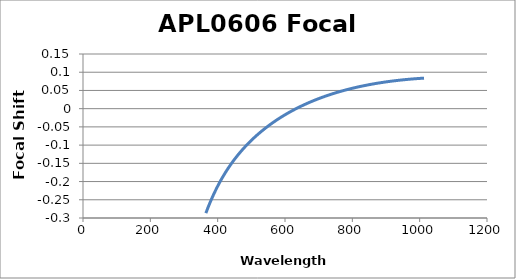
| Category | Focal Shift (mm) |
|---|---|
| 365.0 | -0.287 |
| 366.0 | -0.284 |
| 367.0 | -0.282 |
| 368.0 | -0.279 |
| 369.0 | -0.277 |
| 370.0 | -0.275 |
| 371.0 | -0.272 |
| 372.0 | -0.27 |
| 373.0 | -0.268 |
| 374.0 | -0.265 |
| 375.0 | -0.263 |
| 376.0 | -0.261 |
| 377.0 | -0.258 |
| 378.0 | -0.256 |
| 379.0 | -0.254 |
| 380.0 | -0.252 |
| 381.0 | -0.25 |
| 382.0 | -0.248 |
| 383.0 | -0.246 |
| 384.0 | -0.243 |
| 385.0 | -0.241 |
| 386.0 | -0.239 |
| 387.0 | -0.237 |
| 388.0 | -0.235 |
| 389.0 | -0.233 |
| 390.0 | -0.231 |
| 391.0 | -0.229 |
| 392.0 | -0.228 |
| 393.0 | -0.226 |
| 394.0 | -0.224 |
| 395.0 | -0.222 |
| 396.0 | -0.22 |
| 397.0 | -0.218 |
| 398.0 | -0.216 |
| 399.0 | -0.214 |
| 400.0 | -0.213 |
| 401.0 | -0.211 |
| 402.0 | -0.209 |
| 403.0 | -0.207 |
| 404.0 | -0.206 |
| 405.0 | -0.204 |
| 406.0 | -0.202 |
| 407.0 | -0.201 |
| 408.0 | -0.199 |
| 409.0 | -0.197 |
| 410.0 | -0.196 |
| 411.0 | -0.194 |
| 412.0 | -0.192 |
| 413.0 | -0.191 |
| 414.0 | -0.189 |
| 415.0 | -0.188 |
| 416.0 | -0.186 |
| 417.0 | -0.184 |
| 418.0 | -0.183 |
| 419.0 | -0.181 |
| 420.0 | -0.18 |
| 421.0 | -0.178 |
| 422.0 | -0.177 |
| 423.0 | -0.175 |
| 424.0 | -0.174 |
| 425.0 | -0.172 |
| 426.0 | -0.171 |
| 427.0 | -0.169 |
| 428.0 | -0.168 |
| 429.0 | -0.167 |
| 430.0 | -0.165 |
| 431.0 | -0.164 |
| 432.0 | -0.162 |
| 433.0 | -0.161 |
| 434.0 | -0.16 |
| 435.0 | -0.158 |
| 436.0 | -0.157 |
| 437.0 | -0.156 |
| 438.0 | -0.154 |
| 439.0 | -0.153 |
| 440.0 | -0.152 |
| 441.0 | -0.15 |
| 442.0 | -0.149 |
| 443.0 | -0.148 |
| 444.0 | -0.147 |
| 445.0 | -0.145 |
| 446.0 | -0.144 |
| 447.0 | -0.143 |
| 448.0 | -0.142 |
| 449.0 | -0.14 |
| 450.0 | -0.139 |
| 451.0 | -0.138 |
| 452.0 | -0.137 |
| 453.0 | -0.135 |
| 454.0 | -0.134 |
| 455.0 | -0.133 |
| 456.0 | -0.132 |
| 457.0 | -0.131 |
| 458.0 | -0.13 |
| 459.0 | -0.128 |
| 460.0 | -0.127 |
| 461.0 | -0.126 |
| 462.0 | -0.125 |
| 463.0 | -0.124 |
| 464.0 | -0.123 |
| 465.0 | -0.122 |
| 466.0 | -0.121 |
| 467.0 | -0.12 |
| 468.0 | -0.118 |
| 469.0 | -0.117 |
| 470.0 | -0.116 |
| 471.0 | -0.115 |
| 472.0 | -0.114 |
| 473.0 | -0.113 |
| 474.0 | -0.112 |
| 475.0 | -0.111 |
| 476.0 | -0.11 |
| 477.0 | -0.109 |
| 478.0 | -0.108 |
| 479.0 | -0.107 |
| 480.0 | -0.106 |
| 481.0 | -0.105 |
| 482.0 | -0.104 |
| 483.0 | -0.103 |
| 484.0 | -0.102 |
| 485.0 | -0.101 |
| 486.0 | -0.1 |
| 487.0 | -0.099 |
| 488.0 | -0.098 |
| 489.0 | -0.097 |
| 490.0 | -0.096 |
| 491.0 | -0.095 |
| 492.0 | -0.094 |
| 493.0 | -0.093 |
| 494.0 | -0.092 |
| 495.0 | -0.092 |
| 496.0 | -0.091 |
| 497.0 | -0.09 |
| 498.0 | -0.089 |
| 499.0 | -0.088 |
| 500.0 | -0.087 |
| 501.0 | -0.086 |
| 502.0 | -0.085 |
| 503.0 | -0.084 |
| 504.0 | -0.083 |
| 505.0 | -0.083 |
| 506.0 | -0.082 |
| 507.0 | -0.081 |
| 508.0 | -0.08 |
| 509.0 | -0.079 |
| 510.0 | -0.078 |
| 511.0 | -0.077 |
| 512.0 | -0.077 |
| 513.0 | -0.076 |
| 514.0 | -0.075 |
| 515.0 | -0.074 |
| 516.0 | -0.073 |
| 517.0 | -0.072 |
| 518.0 | -0.072 |
| 519.0 | -0.071 |
| 520.0 | -0.07 |
| 521.0 | -0.069 |
| 522.0 | -0.068 |
| 523.0 | -0.068 |
| 524.0 | -0.067 |
| 525.0 | -0.066 |
| 526.0 | -0.065 |
| 527.0 | -0.065 |
| 528.0 | -0.064 |
| 529.0 | -0.063 |
| 530.0 | -0.062 |
| 531.0 | -0.061 |
| 532.0 | -0.061 |
| 533.0 | -0.06 |
| 534.0 | -0.059 |
| 535.0 | -0.058 |
| 536.0 | -0.058 |
| 537.0 | -0.057 |
| 538.0 | -0.056 |
| 539.0 | -0.055 |
| 540.0 | -0.055 |
| 541.0 | -0.054 |
| 542.0 | -0.053 |
| 543.0 | -0.053 |
| 544.0 | -0.052 |
| 545.0 | -0.051 |
| 546.0 | -0.05 |
| 547.0 | -0.05 |
| 548.0 | -0.049 |
| 549.0 | -0.048 |
| 550.0 | -0.048 |
| 551.0 | -0.047 |
| 552.0 | -0.046 |
| 553.0 | -0.046 |
| 554.0 | -0.045 |
| 555.0 | -0.044 |
| 556.0 | -0.044 |
| 557.0 | -0.043 |
| 558.0 | -0.042 |
| 559.0 | -0.042 |
| 560.0 | -0.041 |
| 561.0 | -0.04 |
| 562.0 | -0.04 |
| 563.0 | -0.039 |
| 564.0 | -0.038 |
| 565.0 | -0.038 |
| 566.0 | -0.037 |
| 567.0 | -0.036 |
| 568.0 | -0.036 |
| 569.0 | -0.035 |
| 570.0 | -0.034 |
| 571.0 | -0.034 |
| 572.0 | -0.033 |
| 573.0 | -0.033 |
| 574.0 | -0.032 |
| 575.0 | -0.031 |
| 576.0 | -0.031 |
| 577.0 | -0.03 |
| 578.0 | -0.03 |
| 579.0 | -0.029 |
| 580.0 | -0.028 |
| 581.0 | -0.028 |
| 582.0 | -0.027 |
| 583.0 | -0.027 |
| 584.0 | -0.026 |
| 585.0 | -0.025 |
| 586.0 | -0.025 |
| 587.0 | -0.024 |
| 588.0 | -0.024 |
| 589.0 | -0.023 |
| 590.0 | -0.022 |
| 591.0 | -0.022 |
| 592.0 | -0.021 |
| 593.0 | -0.021 |
| 594.0 | -0.02 |
| 595.0 | -0.02 |
| 596.0 | -0.019 |
| 597.0 | -0.018 |
| 598.0 | -0.018 |
| 599.0 | -0.017 |
| 600.0 | -0.017 |
| 601.0 | -0.016 |
| 602.0 | -0.016 |
| 603.0 | -0.015 |
| 604.0 | -0.015 |
| 605.0 | -0.014 |
| 606.0 | -0.014 |
| 607.0 | -0.013 |
| 608.0 | -0.013 |
| 609.0 | -0.012 |
| 610.0 | -0.011 |
| 611.0 | -0.011 |
| 612.0 | -0.01 |
| 613.0 | -0.01 |
| 614.0 | -0.009 |
| 615.0 | -0.009 |
| 616.0 | -0.008 |
| 617.0 | -0.008 |
| 618.0 | -0.007 |
| 619.0 | -0.007 |
| 620.0 | -0.006 |
| 621.0 | -0.006 |
| 622.0 | -0.005 |
| 623.0 | -0.005 |
| 624.0 | -0.004 |
| 625.0 | -0.004 |
| 626.0 | -0.003 |
| 627.0 | -0.003 |
| 628.0 | -0.002 |
| 629.0 | -0.002 |
| 630.0 | -0.001 |
| 631.0 | -0.001 |
| 632.0 | 0 |
| 633.0 | 0 |
| 634.0 | 0 |
| 635.0 | 0.001 |
| 636.0 | 0.001 |
| 637.0 | 0.002 |
| 638.0 | 0.002 |
| 639.0 | 0.003 |
| 640.0 | 0.003 |
| 641.0 | 0.004 |
| 642.0 | 0.004 |
| 643.0 | 0.005 |
| 644.0 | 0.005 |
| 645.0 | 0.006 |
| 646.0 | 0.006 |
| 647.0 | 0.006 |
| 648.0 | 0.007 |
| 649.0 | 0.007 |
| 650.0 | 0.008 |
| 651.0 | 0.008 |
| 652.0 | 0.009 |
| 653.0 | 0.009 |
| 654.0 | 0.01 |
| 655.0 | 0.01 |
| 656.0 | 0.01 |
| 657.0 | 0.011 |
| 658.0 | 0.011 |
| 659.0 | 0.012 |
| 660.0 | 0.012 |
| 661.0 | 0.012 |
| 662.0 | 0.013 |
| 663.0 | 0.013 |
| 664.0 | 0.014 |
| 665.0 | 0.014 |
| 666.0 | 0.015 |
| 667.0 | 0.015 |
| 668.0 | 0.015 |
| 669.0 | 0.016 |
| 670.0 | 0.016 |
| 671.0 | 0.017 |
| 672.0 | 0.017 |
| 673.0 | 0.017 |
| 674.0 | 0.018 |
| 675.0 | 0.018 |
| 676.0 | 0.019 |
| 677.0 | 0.019 |
| 678.0 | 0.019 |
| 679.0 | 0.02 |
| 680.0 | 0.02 |
| 681.0 | 0.021 |
| 682.0 | 0.021 |
| 683.0 | 0.021 |
| 684.0 | 0.022 |
| 685.0 | 0.022 |
| 686.0 | 0.022 |
| 687.0 | 0.023 |
| 688.0 | 0.023 |
| 689.0 | 0.024 |
| 690.0 | 0.024 |
| 691.0 | 0.024 |
| 692.0 | 0.025 |
| 693.0 | 0.025 |
| 694.0 | 0.025 |
| 695.0 | 0.026 |
| 696.0 | 0.026 |
| 697.0 | 0.026 |
| 698.0 | 0.027 |
| 699.0 | 0.027 |
| 700.0 | 0.028 |
| 701.0 | 0.028 |
| 702.0 | 0.028 |
| 703.0 | 0.029 |
| 704.0 | 0.029 |
| 705.0 | 0.029 |
| 706.0 | 0.03 |
| 707.0 | 0.03 |
| 708.0 | 0.03 |
| 709.0 | 0.031 |
| 710.0 | 0.031 |
| 711.0 | 0.031 |
| 712.0 | 0.032 |
| 713.0 | 0.032 |
| 714.0 | 0.032 |
| 715.0 | 0.033 |
| 716.0 | 0.033 |
| 717.0 | 0.033 |
| 718.0 | 0.034 |
| 719.0 | 0.034 |
| 720.0 | 0.034 |
| 721.0 | 0.035 |
| 722.0 | 0.035 |
| 723.0 | 0.035 |
| 724.0 | 0.036 |
| 725.0 | 0.036 |
| 726.0 | 0.036 |
| 727.0 | 0.036 |
| 728.0 | 0.037 |
| 729.0 | 0.037 |
| 730.0 | 0.037 |
| 731.0 | 0.038 |
| 732.0 | 0.038 |
| 733.0 | 0.038 |
| 734.0 | 0.039 |
| 735.0 | 0.039 |
| 736.0 | 0.039 |
| 737.0 | 0.04 |
| 738.0 | 0.04 |
| 739.0 | 0.04 |
| 740.0 | 0.04 |
| 741.0 | 0.041 |
| 742.0 | 0.041 |
| 743.0 | 0.041 |
| 744.0 | 0.042 |
| 745.0 | 0.042 |
| 746.0 | 0.042 |
| 747.0 | 0.042 |
| 748.0 | 0.043 |
| 749.0 | 0.043 |
| 750.0 | 0.043 |
| 751.0 | 0.044 |
| 752.0 | 0.044 |
| 753.0 | 0.044 |
| 754.0 | 0.044 |
| 755.0 | 0.045 |
| 756.0 | 0.045 |
| 757.0 | 0.045 |
| 758.0 | 0.046 |
| 759.0 | 0.046 |
| 760.0 | 0.046 |
| 761.0 | 0.046 |
| 762.0 | 0.047 |
| 763.0 | 0.047 |
| 764.0 | 0.047 |
| 765.0 | 0.047 |
| 766.0 | 0.048 |
| 767.0 | 0.048 |
| 768.0 | 0.048 |
| 769.0 | 0.048 |
| 770.0 | 0.049 |
| 771.0 | 0.049 |
| 772.0 | 0.049 |
| 773.0 | 0.05 |
| 774.0 | 0.05 |
| 775.0 | 0.05 |
| 776.0 | 0.05 |
| 777.0 | 0.051 |
| 778.0 | 0.051 |
| 779.0 | 0.051 |
| 780.0 | 0.051 |
| 781.0 | 0.051 |
| 782.0 | 0.052 |
| 783.0 | 0.052 |
| 784.0 | 0.052 |
| 785.0 | 0.052 |
| 786.0 | 0.053 |
| 787.0 | 0.053 |
| 788.0 | 0.053 |
| 789.0 | 0.053 |
| 790.0 | 0.054 |
| 791.0 | 0.054 |
| 792.0 | 0.054 |
| 793.0 | 0.054 |
| 794.0 | 0.055 |
| 795.0 | 0.055 |
| 796.0 | 0.055 |
| 797.0 | 0.055 |
| 798.0 | 0.055 |
| 799.0 | 0.056 |
| 800.0 | 0.056 |
| 801.0 | 0.056 |
| 802.0 | 0.056 |
| 803.0 | 0.057 |
| 804.0 | 0.057 |
| 805.0 | 0.057 |
| 806.0 | 0.057 |
| 807.0 | 0.057 |
| 808.0 | 0.058 |
| 809.0 | 0.058 |
| 810.0 | 0.058 |
| 811.0 | 0.058 |
| 812.0 | 0.059 |
| 813.0 | 0.059 |
| 814.0 | 0.059 |
| 815.0 | 0.059 |
| 816.0 | 0.059 |
| 817.0 | 0.06 |
| 818.0 | 0.06 |
| 819.0 | 0.06 |
| 820.0 | 0.06 |
| 821.0 | 0.06 |
| 822.0 | 0.061 |
| 823.0 | 0.061 |
| 824.0 | 0.061 |
| 825.0 | 0.061 |
| 826.0 | 0.061 |
| 827.0 | 0.062 |
| 828.0 | 0.062 |
| 829.0 | 0.062 |
| 830.0 | 0.062 |
| 831.0 | 0.062 |
| 832.0 | 0.063 |
| 833.0 | 0.063 |
| 834.0 | 0.063 |
| 835.0 | 0.063 |
| 836.0 | 0.063 |
| 837.0 | 0.063 |
| 838.0 | 0.064 |
| 839.0 | 0.064 |
| 840.0 | 0.064 |
| 841.0 | 0.064 |
| 842.0 | 0.064 |
| 843.0 | 0.065 |
| 844.0 | 0.065 |
| 845.0 | 0.065 |
| 846.0 | 0.065 |
| 847.0 | 0.065 |
| 848.0 | 0.065 |
| 849.0 | 0.066 |
| 850.0 | 0.066 |
| 851.0 | 0.066 |
| 852.0 | 0.066 |
| 853.0 | 0.066 |
| 854.0 | 0.067 |
| 855.0 | 0.067 |
| 856.0 | 0.067 |
| 857.0 | 0.067 |
| 858.0 | 0.067 |
| 859.0 | 0.067 |
| 860.0 | 0.068 |
| 861.0 | 0.068 |
| 862.0 | 0.068 |
| 863.0 | 0.068 |
| 864.0 | 0.068 |
| 865.0 | 0.068 |
| 866.0 | 0.069 |
| 867.0 | 0.069 |
| 868.0 | 0.069 |
| 869.0 | 0.069 |
| 870.0 | 0.069 |
| 871.0 | 0.069 |
| 872.0 | 0.069 |
| 873.0 | 0.07 |
| 874.0 | 0.07 |
| 875.0 | 0.07 |
| 876.0 | 0.07 |
| 877.0 | 0.07 |
| 878.0 | 0.07 |
| 879.0 | 0.07 |
| 880.0 | 0.071 |
| 881.0 | 0.071 |
| 882.0 | 0.071 |
| 883.0 | 0.071 |
| 884.0 | 0.071 |
| 885.0 | 0.071 |
| 886.0 | 0.072 |
| 887.0 | 0.072 |
| 888.0 | 0.072 |
| 889.0 | 0.072 |
| 890.0 | 0.072 |
| 891.0 | 0.072 |
| 892.0 | 0.072 |
| 893.0 | 0.072 |
| 894.0 | 0.073 |
| 895.0 | 0.073 |
| 896.0 | 0.073 |
| 897.0 | 0.073 |
| 898.0 | 0.073 |
| 899.0 | 0.073 |
| 900.0 | 0.073 |
| 901.0 | 0.074 |
| 902.0 | 0.074 |
| 903.0 | 0.074 |
| 904.0 | 0.074 |
| 905.0 | 0.074 |
| 906.0 | 0.074 |
| 907.0 | 0.074 |
| 908.0 | 0.074 |
| 909.0 | 0.075 |
| 910.0 | 0.075 |
| 911.0 | 0.075 |
| 912.0 | 0.075 |
| 913.0 | 0.075 |
| 914.0 | 0.075 |
| 915.0 | 0.075 |
| 916.0 | 0.075 |
| 917.0 | 0.076 |
| 918.0 | 0.076 |
| 919.0 | 0.076 |
| 920.0 | 0.076 |
| 921.0 | 0.076 |
| 922.0 | 0.076 |
| 923.0 | 0.076 |
| 924.0 | 0.076 |
| 925.0 | 0.076 |
| 926.0 | 0.077 |
| 927.0 | 0.077 |
| 928.0 | 0.077 |
| 929.0 | 0.077 |
| 930.0 | 0.077 |
| 931.0 | 0.077 |
| 932.0 | 0.077 |
| 933.0 | 0.077 |
| 934.0 | 0.077 |
| 935.0 | 0.078 |
| 936.0 | 0.078 |
| 937.0 | 0.078 |
| 938.0 | 0.078 |
| 939.0 | 0.078 |
| 940.0 | 0.078 |
| 941.0 | 0.078 |
| 942.0 | 0.078 |
| 943.0 | 0.078 |
| 944.0 | 0.078 |
| 945.0 | 0.079 |
| 946.0 | 0.079 |
| 947.0 | 0.079 |
| 948.0 | 0.079 |
| 949.0 | 0.079 |
| 950.0 | 0.079 |
| 951.0 | 0.079 |
| 952.0 | 0.079 |
| 953.0 | 0.079 |
| 954.0 | 0.079 |
| 955.0 | 0.08 |
| 956.0 | 0.08 |
| 957.0 | 0.08 |
| 958.0 | 0.08 |
| 959.0 | 0.08 |
| 960.0 | 0.08 |
| 961.0 | 0.08 |
| 962.0 | 0.08 |
| 963.0 | 0.08 |
| 964.0 | 0.08 |
| 965.0 | 0.08 |
| 966.0 | 0.08 |
| 967.0 | 0.081 |
| 968.0 | 0.081 |
| 969.0 | 0.081 |
| 970.0 | 0.081 |
| 971.0 | 0.081 |
| 972.0 | 0.081 |
| 973.0 | 0.081 |
| 974.0 | 0.081 |
| 975.0 | 0.081 |
| 976.0 | 0.081 |
| 977.0 | 0.081 |
| 978.0 | 0.081 |
| 979.0 | 0.082 |
| 980.0 | 0.082 |
| 981.0 | 0.082 |
| 982.0 | 0.082 |
| 983.0 | 0.082 |
| 984.0 | 0.082 |
| 985.0 | 0.082 |
| 986.0 | 0.082 |
| 987.0 | 0.082 |
| 988.0 | 0.082 |
| 989.0 | 0.082 |
| 990.0 | 0.082 |
| 991.0 | 0.082 |
| 992.0 | 0.082 |
| 993.0 | 0.083 |
| 994.0 | 0.083 |
| 995.0 | 0.083 |
| 996.0 | 0.083 |
| 997.0 | 0.083 |
| 998.0 | 0.083 |
| 999.0 | 0.083 |
| 1000.0 | 0.083 |
| 1001.0 | 0.083 |
| 1002.0 | 0.083 |
| 1003.0 | 0.083 |
| 1004.0 | 0.083 |
| 1005.0 | 0.083 |
| 1006.0 | 0.083 |
| 1007.0 | 0.083 |
| 1008.0 | 0.083 |
| 1009.0 | 0.084 |
| 1010.0 | 0.084 |
| 1011.0 | 0.084 |
| 1012.0 | 0.084 |
| 1013.0 | 0.084 |